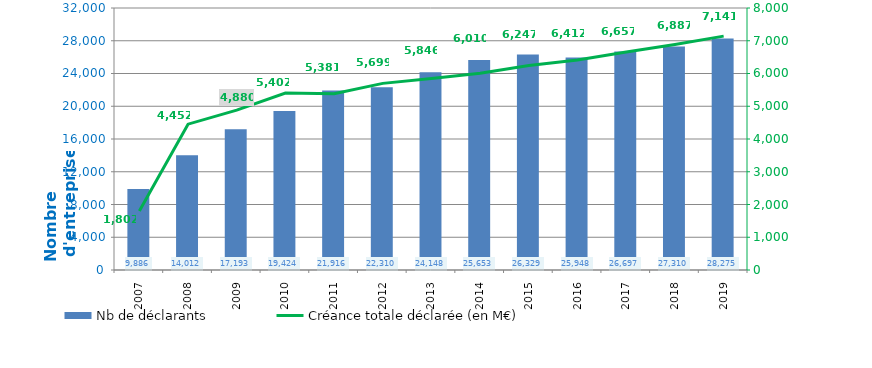
| Category | Nb de déclarants |
|---|---|
| 2007.0 | 9886 |
| 2008.0 | 14012 |
| 2009.0 | 17193 |
| 2010.0 | 19424 |
| 2011.0 | 21916 |
| 2012.0 | 22310 |
| 2013.0 | 24148 |
| 2014.0 | 25653 |
| 2015.0 | 26329 |
| 2016.0 | 25948 |
| 2017.0 | 26697 |
| 2018.0 | 27310 |
| 2019.0 | 28275 |